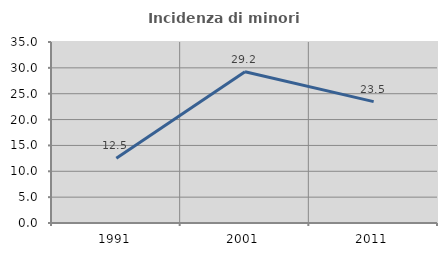
| Category | Incidenza di minori stranieri |
|---|---|
| 1991.0 | 12.5 |
| 2001.0 | 29.242 |
| 2011.0 | 23.475 |